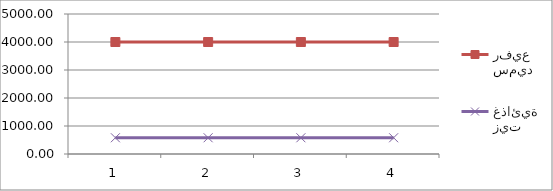
| Category | سميد رفيع | زيت غذائية |
|---|---|---|
| 0 | 4000 | 580 |
| 1 | 4000 | 580 |
| 2 | 4000 | 580 |
| 3 | 4000 | 580 |